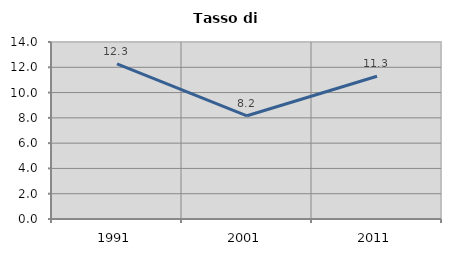
| Category | Tasso di disoccupazione   |
|---|---|
| 1991.0 | 12.27 |
| 2001.0 | 8.163 |
| 2011.0 | 11.29 |